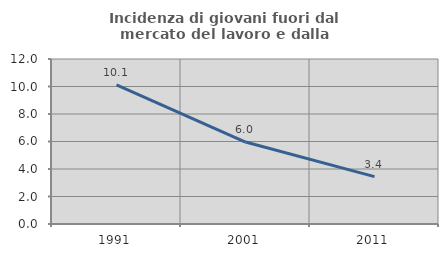
| Category | Incidenza di giovani fuori dal mercato del lavoro e dalla formazione  |
|---|---|
| 1991.0 | 10.119 |
| 2001.0 | 5.96 |
| 2011.0 | 3.448 |